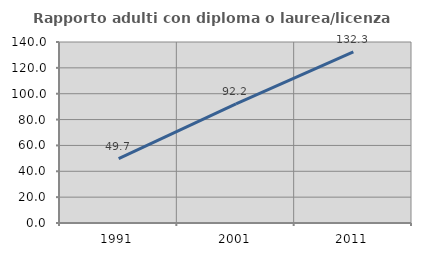
| Category | Rapporto adulti con diploma o laurea/licenza media  |
|---|---|
| 1991.0 | 49.727 |
| 2001.0 | 92.171 |
| 2011.0 | 132.289 |